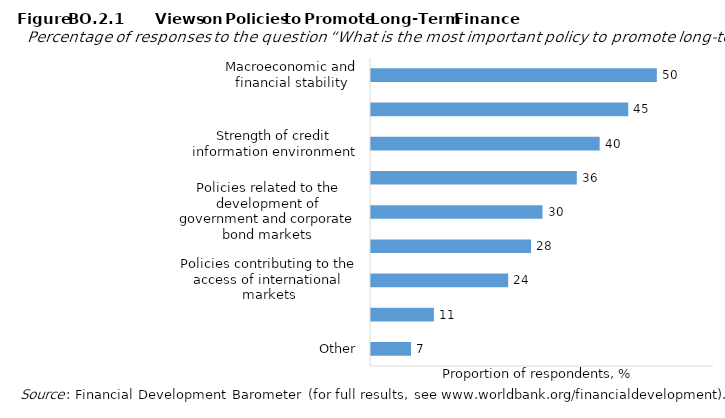
| Category | Proportion of respondents, % |
|---|---|
| Other | 7 |
| Direct intervention, including by state-owned banks | 11 |
| Policies contributing to the access of international markets | 24 |
| Competition policy to ensure market contest | 28 |
| Policies related to the development of government and corporate bond markets | 30 |
| Policies contributing to the development of stock market | 36 |
| Strength of credit information environment | 40 |
| Institutional reforms | 45 |
| Macroeconomic and financial stability | 50 |